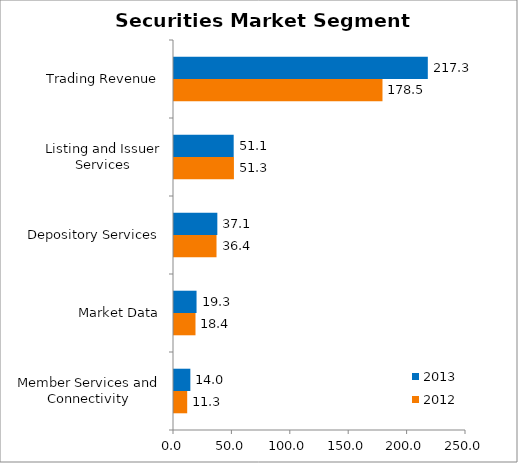
| Category | 2012 | 2013 |
|---|---|---|
| Member Services and Connectivity | 11.3 | 14 |
| Market Data | 18.4 | 19.3 |
| Depository Services | 36.4 | 37.1 |
| Listing and Issuer Services | 51.3 | 51.1 |
| Trading Revenue | 178.5 | 217.3 |